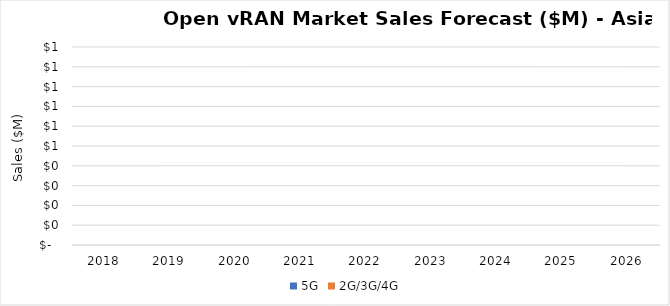
| Category | 5G | 2G/3G/4G |
|---|---|---|
| 2018.0 | 0 | 0 |
| 2019.0 | 0 | 0 |
| 2020.0 | 0 | 0 |
| 2021.0 | 0 | 0 |
| 2022.0 | 0 | 0 |
| 2023.0 | 0 | 0 |
| 2024.0 | 0 | 0 |
| 2025.0 | 0 | 0 |
| 2026.0 | 0 | 0 |